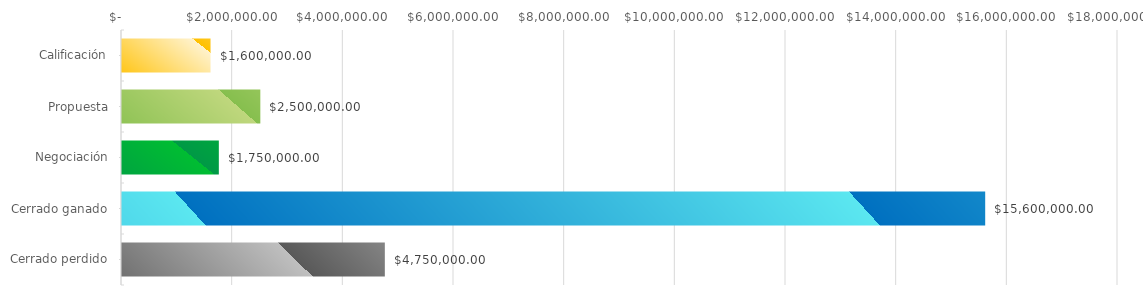
| Category | Series 0 |
|---|---|
| Calificación | 1600000 |
| Propuesta | 2500000 |
| Negociación | 1750000 |
| Cerrado ganado | 15600000 |
| Cerrado perdido | 4750000 |